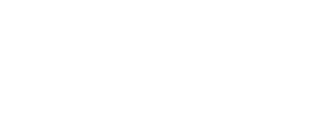
| Category | Series 1 | Series 0 |
|---|---|---|
| 0 | 0 | 0 |